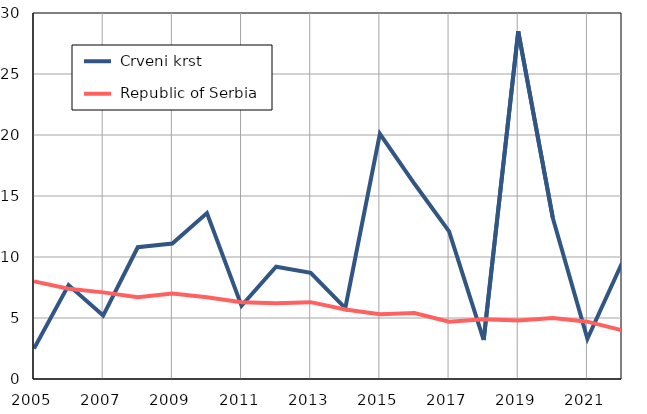
| Category |  Crveni krst |  Republic of Serbia |
|---|---|---|
| 2005.0 | 2.5 | 8 |
| 2006.0 | 7.7 | 7.4 |
| 2007.0 | 5.2 | 7.1 |
| 2008.0 | 10.8 | 6.7 |
| 2009.0 | 11.1 | 7 |
| 2010.0 | 13.6 | 6.7 |
| 2011.0 | 6 | 6.3 |
| 2012.0 | 9.2 | 6.2 |
| 2013.0 | 8.7 | 6.3 |
| 2014.0 | 5.8 | 5.7 |
| 2015.0 | 20.1 | 5.3 |
| 2016.0 | 16 | 5.4 |
| 2017.0 | 12.1 | 4.7 |
| 2018.0 | 3.2 | 4.9 |
| 2019.0 | 28.5 | 4.8 |
| 2020.0 | 13.2 | 5 |
| 2021.0 | 3.3 | 4.7 |
| 2022.0 | 9.5 | 4 |